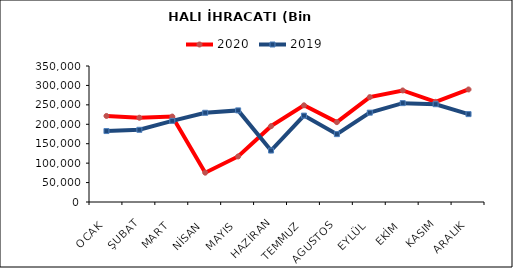
| Category | 2020 | 2019 |
|---|---|---|
| OCAK | 221439.794 | 182583.07 |
| ŞUBAT | 216850.7 | 185830.756 |
| MART | 219895.739 | 208839.271 |
| NİSAN | 75483.475 | 229647.181 |
| MAYIS | 117221.57 | 235732.898 |
| HAZİRAN | 195131.128 | 132447.505 |
| TEMMUZ | 248832.673 | 222318.124 |
| AGUSTOS | 205496.748 | 174648.941 |
| EYLÜL | 269873.137 | 229949.9 |
| EKİM | 287035.818 | 254431.575 |
| KASIM | 257769.291 | 251664.052 |
| ARALIK | 289618.32 | 226168.498 |